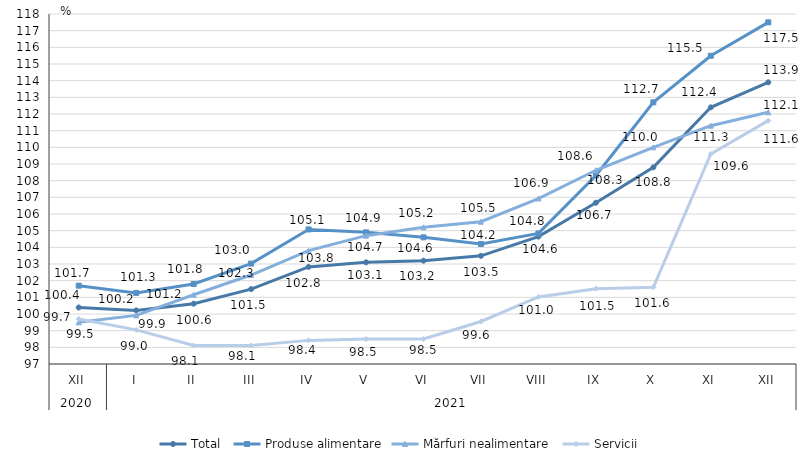
| Category | Total  | Produse alimentare | Mărfuri nealimentare  | Servicii |
|---|---|---|---|---|
| 0 | 100.39 | 101.7 | 99.5 | 99.7 |
| 1 | 100.216 | 101.263 | 99.917 | 99.046 |
| 2 | 100.619 | 101.8 | 101.154 | 98.109 |
| 3 | 101.493 | 103.024 | 102.337 | 98.107 |
| 4 | 102.826 | 105.075 | 103.801 | 98.417 |
| 5 | 103.1 | 104.9 | 104.7 | 98.5 |
| 6 | 103.2 | 104.6 | 105.2 | 98.5 |
| 7 | 103.49 | 104.2 | 105.54 | 99.55 |
| 8 | 104.645 | 104.834 | 106.928 | 101.023 |
| 9 | 106.675 | 108.308 | 108.624 | 101.521 |
| 10 | 108.8 | 112.7 | 110 | 101.6 |
| 11 | 112.4 | 115.494 | 111.3 | 109.6 |
| 12 | 113.9 | 117.5 | 112.1 | 111.6 |